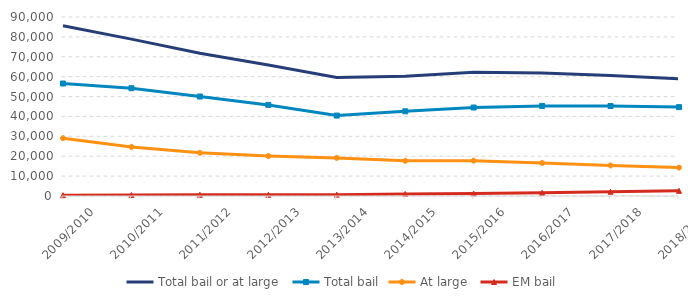
| Category | Total bail or at large | Total bail | At large | EM bail |
|---|---|---|---|---|
| 2009/2010 | 85631 | 56553 | 29078 | 394 |
| 2010/2011 | 78875 | 54192 | 24683 | 498 |
| 2011/2012 | 71736 | 50024 | 21712 | 600 |
| 2012/2013 | 65870 | 45805 | 20065 | 606 |
| 2013/2014 | 59579 | 40431 | 19148 | 685 |
| 2014/2015 | 60251 | 42586 | 17665 | 1017 |
| 2015/2016 | 62244 | 44483 | 17761 | 1280 |
| 2016/2017 | 61893 | 45292 | 16601 | 1600 |
| 2017/2018 | 60616 | 45247 | 15369 | 2132 |
| 2018/2019 | 58951 | 44680 | 14271 | 2595 |